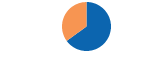
| Category | Series 0 |
|---|---|
| 0 | 650000 |
| 1 | 350000 |